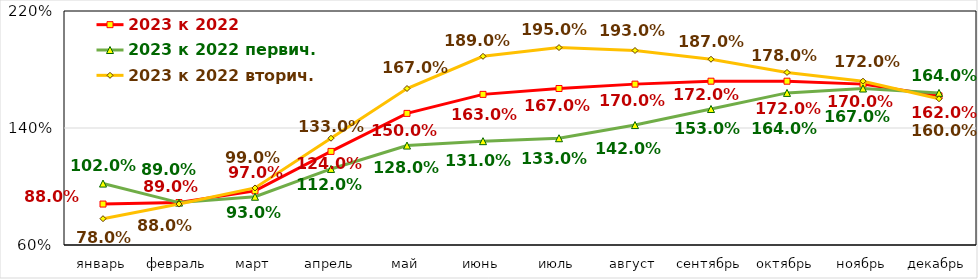
| Category | 2023 к 2022 | 2023 к 2022 первич. | 2023 к 2022 вторич. |
|---|---|---|---|
| январь | 0.88 | 1.02 | 0.78 |
| февраль | 0.89 | 0.89 | 0.88 |
| март | 0.97 | 0.93 | 0.99 |
| апрель | 1.24 | 1.12 | 1.33 |
| май | 1.5 | 1.28 | 1.67 |
| июнь | 1.63 | 1.31 | 1.89 |
| июль | 1.67 | 1.33 | 1.95 |
| август | 1.7 | 1.42 | 1.93 |
| сентябрь | 1.72 | 1.53 | 1.87 |
| октябрь | 1.72 | 1.64 | 1.78 |
| ноябрь | 1.7 | 1.67 | 1.72 |
| декабрь | 1.62 | 1.64 | 1.6 |